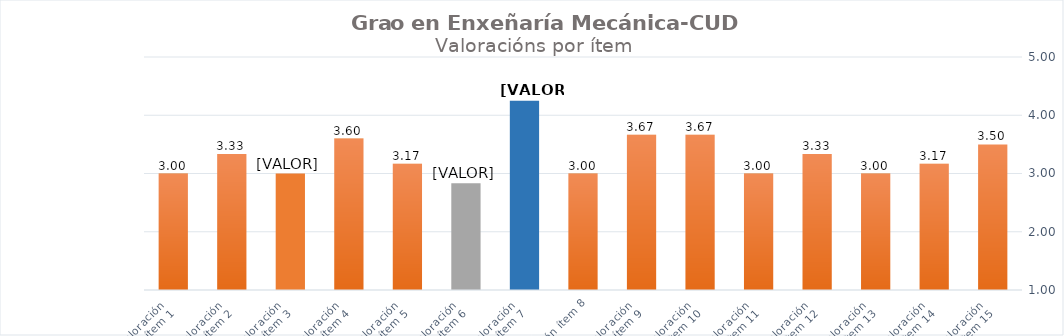
| Category | Series 0 |
|---|---|
| Valoración 
ítem 1 | 3 |
| Valoración 
ítem 2 | 3.333 |
| Valoración 
ítem 3 | 3 |
| Valoración 
ítem 4 | 3.6 |
| Valoración 
ítem 5 | 3.167 |
| Valoración 
ítem 6 | 2.833 |
| Valoración 
ítem 7 | 4.25 |
| Valoración ítem 8 | 3 |
| Valoración 
ítem 9 | 3.667 |
| Valoración 
ítem 10 | 3.667 |
| Valoración 
ítem 11 | 3 |
| Valoración 
ítem 12 | 3.333 |
| Valoración 
ítem 13 | 3 |
| Valoración 
ítem 14 | 3.167 |
| Valoración 
ítem 15 | 3.5 |